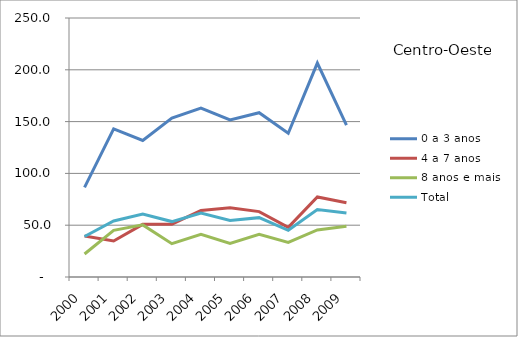
| Category | 0 a 3 anos | 4 a 7 anos | 8 anos e mais | Total |
|---|---|---|---|---|
| 2000.0 | 86.5 | 39.5 | 22.2 | 39.1 |
| 2001.0 | 142.9 | 34.7 | 45 | 54.1 |
| 2002.0 | 131.8 | 50.8 | 50.3 | 60.7 |
| 2003.0 | 153.5 | 51 | 32.2 | 53.5 |
| 2004.0 | 163 | 64.2 | 41.3 | 61.8 |
| 2005.0 | 151.6 | 66.9 | 32.3 | 54.5 |
| 2006.0 | 158.6 | 63.1 | 41.3 | 57.3 |
| 2007.0 | 138.7 | 47.9 | 33.4 | 45.1 |
| 2008.0 | 206.5 | 77.3 | 45.4 | 65.1 |
| 2009.0 | 146.5 | 71.6 | 48.9 | 61.8 |